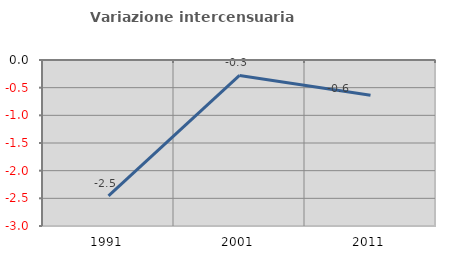
| Category | Variazione intercensuaria annua |
|---|---|
| 1991.0 | -2.457 |
| 2001.0 | -0.28 |
| 2011.0 | -0.636 |